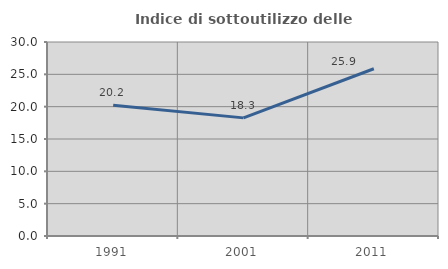
| Category | Indice di sottoutilizzo delle abitazioni  |
|---|---|
| 1991.0 | 20.211 |
| 2001.0 | 18.266 |
| 2011.0 | 25.859 |